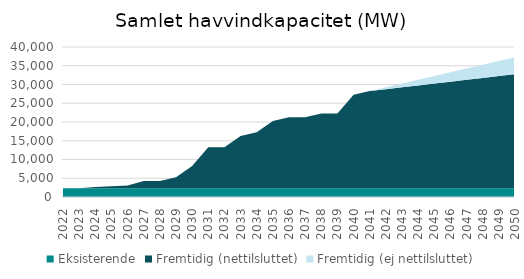
| Category | Eksisterende | Fremtidig (nettilsluttet) | Fremtidig (ej nettilsluttet) |
|---|---|---|---|
| 2022.0 | 2305.6 | 0 | 0 |
| 2023.0 | 2305.6 | 0 | 0 |
| 2024.0 | 2305.6 | 350 | 0 |
| 2025.0 | 2305.6 | 540 | 0 |
| 2026.0 | 2305.6 | 745 | 0 |
| 2027.0 | 2300.6 | 1950 | 0 |
| 2028.0 | 2300.6 | 1950 | 0 |
| 2029.0 | 2300.6 | 2950 | 0 |
| 2030.0 | 2300.6 | 5950 | 0 |
| 2031.0 | 2300.6 | 10950 | 0 |
| 2032.0 | 2300.6 | 10950 | 0 |
| 2033.0 | 2300.6 | 13950 | 0 |
| 2034.0 | 2300.6 | 14950 | 0 |
| 2035.0 | 2300.6 | 17950 | 0 |
| 2036.0 | 2300.6 | 18950 | 0 |
| 2037.0 | 2300.6 | 18950 | 0 |
| 2038.0 | 2300.6 | 19950 | 0 |
| 2039.0 | 2300.6 | 19950 | 0 |
| 2040.0 | 2300.6 | 24950 | 0 |
| 2041.0 | 2300.6 | 25950 | 0 |
| 2042.0 | 2300.6 | 26450 | 500 |
| 2043.0 | 2300.6 | 26950 | 1000 |
| 2044.0 | 2300.6 | 27450 | 1500 |
| 2045.0 | 2300.6 | 27950 | 2000 |
| 2046.0 | 2300.6 | 28450 | 2500 |
| 2047.0 | 2300.6 | 28950 | 3000 |
| 2048.0 | 2300.6 | 29450 | 3500 |
| 2049.0 | 2300.6 | 29950 | 4000 |
| 2050.0 | 2300.6 | 30450 | 4500 |